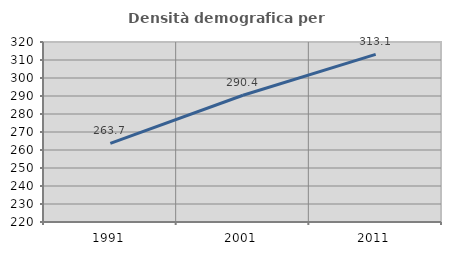
| Category | Densità demografica |
|---|---|
| 1991.0 | 263.728 |
| 2001.0 | 290.428 |
| 2011.0 | 313.112 |